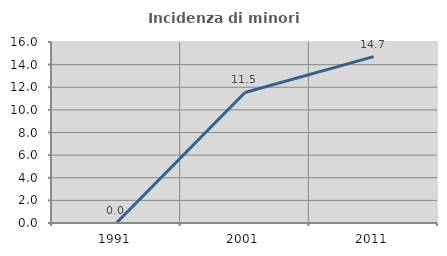
| Category | Incidenza di minori stranieri |
|---|---|
| 1991.0 | 0 |
| 2001.0 | 11.538 |
| 2011.0 | 14.706 |